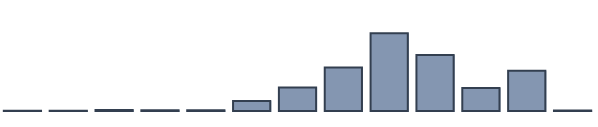
| Category | Series 0 |
|---|---|
| 0 | 0.073 |
| 1 | 0.047 |
| 2 | 0.399 |
| 3 | 0.253 |
| 4 | 0.263 |
| 5 | 3.636 |
| 6 | 8.451 |
| 7 | 15.652 |
| 8 | 28.004 |
| 9 | 20.204 |
| 10 | 8.324 |
| 11 | 14.526 |
| 12 | 0.169 |